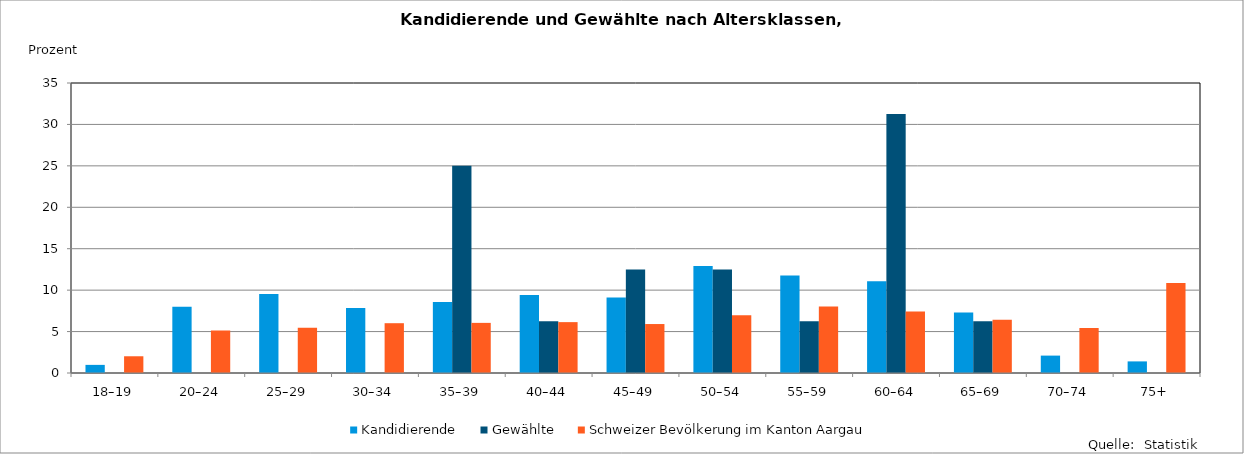
| Category | Kandidierende | Gewählte | Schweizer Bevölkerung im Kanton Aargau |
|---|---|---|---|
| 18–19 | 0.98 | 0 | 2.02 |
| 20–24 | 7.99 | 0 | 5.12 |
| 25–29 | 9.54 | 0 | 5.47 |
| 30–34 | 7.85 | 0 | 6.01 |
| 35–39 | 8.56 | 25 | 6.05 |
| 40–44 | 9.4 | 6.25 | 6.14 |
| 45–49 | 9.12 | 12.5 | 5.91 |
| 50–54 | 12.9 | 12.5 | 6.96 |
| 55–59 | 11.78 | 6.25 | 8.03 |
| 60–64 | 11.08 | 31.25 | 7.43 |
| 65–69 | 7.29 | 6.25 | 6.44 |
| 70–74 | 2.1 | 0 | 5.43 |
| 75+ | 1.4 | 0 | 10.87 |